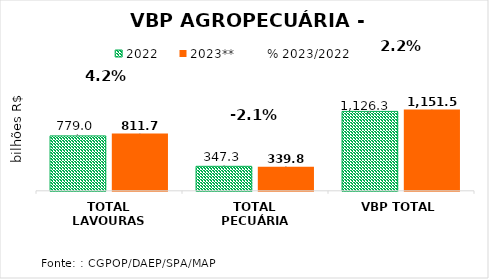
| Category | 2022 | 2023** |
|---|---|---|
| TOTAL LAVOURAS | 778.959 | 811.699 |
| TOTAL PECUÁRIA | 347.315 | 339.867 |
| VBP TOTAL | 1126.274 | 1151.566 |